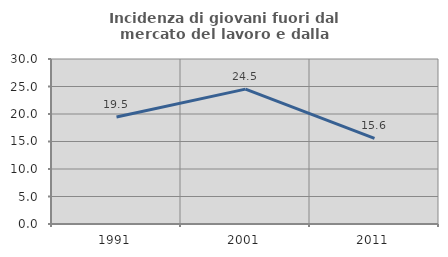
| Category | Incidenza di giovani fuori dal mercato del lavoro e dalla formazione  |
|---|---|
| 1991.0 | 19.463 |
| 2001.0 | 24.52 |
| 2011.0 | 15.564 |